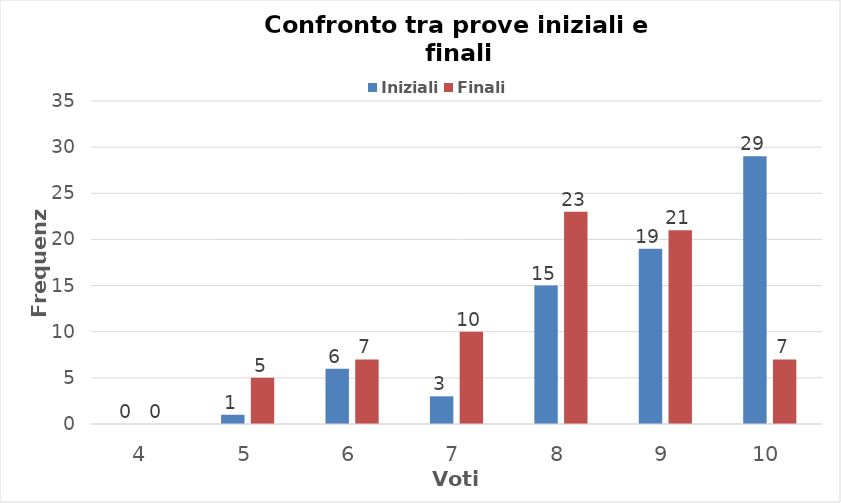
| Category | Iniziali | Finali |
|---|---|---|
| 4.0 | 0 | 0 |
| 5.0 | 1 | 5 |
| 6.0 | 6 | 7 |
| 7.0 | 3 | 10 |
| 8.0 | 15 | 23 |
| 9.0 | 19 | 21 |
| 10.0 | 29 | 7 |